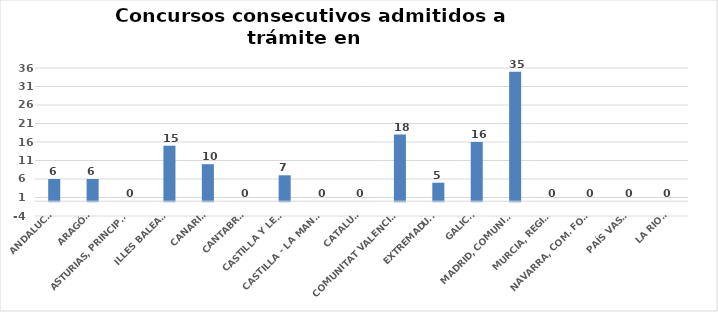
| Category | Series 0 |
|---|---|
| ANDALUCÍA | 6 |
| ARAGÓN | 6 |
| ASTURIAS, PRINCIPADO | 0 |
| ILLES BALEARS | 15 |
| CANARIAS | 10 |
| CANTABRIA | 0 |
| CASTILLA Y LEÓN | 7 |
| CASTILLA - LA MANCHA | 0 |
| CATALUÑA | 0 |
| COMUNITAT VALENCIANA | 18 |
| EXTREMADURA | 5 |
| GALICIA | 16 |
| MADRID, COMUNIDAD | 35 |
| MURCIA, REGIÓN | 0 |
| NAVARRA, COM. FORAL | 0 |
| PAÍS VASCO | 0 |
| LA RIOJA | 0 |